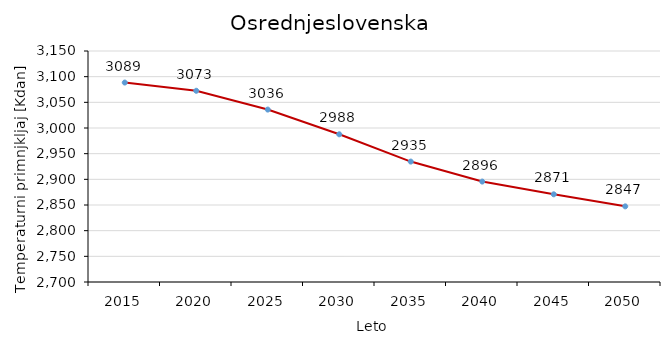
| Category | Osrednjeslovenska |
|---|---|
| 2015.0 | 3088.54 |
| 2020.0 | 3072.522 |
| 2025.0 | 3035.878 |
| 2030.0 | 2987.738 |
| 2035.0 | 2934.591 |
| 2040.0 | 2895.632 |
| 2045.0 | 2870.824 |
| 2050.0 | 2847.359 |